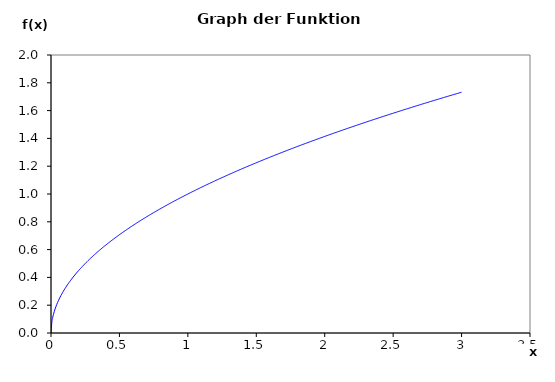
| Category | Series 0 |
|---|---|
| 0.0 | 0 |
| 0.006 | 0.077 |
| 0.012 | 0.11 |
| 0.018000000000000002 | 0.134 |
| 0.024 | 0.155 |
| 0.03 | 0.173 |
| 0.036 | 0.19 |
| 0.041999999999999996 | 0.205 |
| 0.047999999999999994 | 0.219 |
| 0.05399999999999999 | 0.232 |
| 0.05999999999999999 | 0.245 |
| 0.06599999999999999 | 0.257 |
| 0.072 | 0.268 |
| 0.078 | 0.279 |
| 0.084 | 0.29 |
| 0.09000000000000001 | 0.3 |
| 0.09600000000000002 | 0.31 |
| 0.10200000000000002 | 0.319 |
| 0.10800000000000003 | 0.329 |
| 0.11400000000000003 | 0.338 |
| 0.12000000000000004 | 0.346 |
| 0.12600000000000003 | 0.355 |
| 0.13200000000000003 | 0.363 |
| 0.13800000000000004 | 0.371 |
| 0.14400000000000004 | 0.379 |
| 0.15000000000000005 | 0.387 |
| 0.15600000000000006 | 0.395 |
| 0.16200000000000006 | 0.402 |
| 0.16800000000000007 | 0.41 |
| 0.17400000000000007 | 0.417 |
| 0.18000000000000008 | 0.424 |
| 0.18600000000000008 | 0.431 |
| 0.1920000000000001 | 0.438 |
| 0.1980000000000001 | 0.445 |
| 0.2040000000000001 | 0.452 |
| 0.2100000000000001 | 0.458 |
| 0.2160000000000001 | 0.465 |
| 0.22200000000000011 | 0.471 |
| 0.22800000000000012 | 0.477 |
| 0.23400000000000012 | 0.484 |
| 0.24000000000000013 | 0.49 |
| 0.24600000000000014 | 0.496 |
| 0.2520000000000001 | 0.502 |
| 0.2580000000000001 | 0.508 |
| 0.2640000000000001 | 0.514 |
| 0.27000000000000013 | 0.52 |
| 0.27600000000000013 | 0.525 |
| 0.28200000000000014 | 0.531 |
| 0.28800000000000014 | 0.537 |
| 0.29400000000000015 | 0.542 |
| 0.30000000000000016 | 0.548 |
| 0.30600000000000016 | 0.553 |
| 0.31200000000000017 | 0.559 |
| 0.31800000000000017 | 0.564 |
| 0.3240000000000002 | 0.569 |
| 0.3300000000000002 | 0.574 |
| 0.3360000000000002 | 0.58 |
| 0.3420000000000002 | 0.585 |
| 0.3480000000000002 | 0.59 |
| 0.3540000000000002 | 0.595 |
| 0.3600000000000002 | 0.6 |
| 0.3660000000000002 | 0.605 |
| 0.3720000000000002 | 0.61 |
| 0.3780000000000002 | 0.615 |
| 0.38400000000000023 | 0.62 |
| 0.39000000000000024 | 0.624 |
| 0.39600000000000024 | 0.629 |
| 0.40200000000000025 | 0.634 |
| 0.40800000000000025 | 0.639 |
| 0.41400000000000026 | 0.643 |
| 0.42000000000000026 | 0.648 |
| 0.42600000000000027 | 0.653 |
| 0.4320000000000003 | 0.657 |
| 0.4380000000000003 | 0.662 |
| 0.4440000000000003 | 0.666 |
| 0.4500000000000003 | 0.671 |
| 0.4560000000000003 | 0.675 |
| 0.4620000000000003 | 0.68 |
| 0.4680000000000003 | 0.684 |
| 0.4740000000000003 | 0.688 |
| 0.4800000000000003 | 0.693 |
| 0.4860000000000003 | 0.697 |
| 0.4920000000000003 | 0.701 |
| 0.49800000000000033 | 0.706 |
| 0.5040000000000003 | 0.71 |
| 0.5100000000000003 | 0.714 |
| 0.5160000000000003 | 0.718 |
| 0.5220000000000004 | 0.722 |
| 0.5280000000000004 | 0.727 |
| 0.5340000000000004 | 0.731 |
| 0.5400000000000004 | 0.735 |
| 0.5460000000000004 | 0.739 |
| 0.5520000000000004 | 0.743 |
| 0.5580000000000004 | 0.747 |
| 0.5640000000000004 | 0.751 |
| 0.5700000000000004 | 0.755 |
| 0.5760000000000004 | 0.759 |
| 0.5820000000000004 | 0.763 |
| 0.5880000000000004 | 0.767 |
| 0.5940000000000004 | 0.771 |
| 0.6000000000000004 | 0.775 |
| 0.6060000000000004 | 0.778 |
| 0.6120000000000004 | 0.782 |
| 0.6180000000000004 | 0.786 |
| 0.6240000000000004 | 0.79 |
| 0.6300000000000004 | 0.794 |
| 0.6360000000000005 | 0.797 |
| 0.6420000000000005 | 0.801 |
| 0.6480000000000005 | 0.805 |
| 0.6540000000000005 | 0.809 |
| 0.6600000000000005 | 0.812 |
| 0.6660000000000005 | 0.816 |
| 0.6720000000000005 | 0.82 |
| 0.6780000000000005 | 0.823 |
| 0.6840000000000005 | 0.827 |
| 0.6900000000000005 | 0.831 |
| 0.6960000000000005 | 0.834 |
| 0.7020000000000005 | 0.838 |
| 0.7080000000000005 | 0.841 |
| 0.7140000000000005 | 0.845 |
| 0.7200000000000005 | 0.849 |
| 0.7260000000000005 | 0.852 |
| 0.7320000000000005 | 0.856 |
| 0.7380000000000005 | 0.859 |
| 0.7440000000000005 | 0.863 |
| 0.7500000000000006 | 0.866 |
| 0.7560000000000006 | 0.869 |
| 0.7620000000000006 | 0.873 |
| 0.7680000000000006 | 0.876 |
| 0.7740000000000006 | 0.88 |
| 0.7800000000000006 | 0.883 |
| 0.7860000000000006 | 0.887 |
| 0.7920000000000006 | 0.89 |
| 0.7980000000000006 | 0.893 |
| 0.8040000000000006 | 0.897 |
| 0.8100000000000006 | 0.9 |
| 0.8160000000000006 | 0.903 |
| 0.8220000000000006 | 0.907 |
| 0.8280000000000006 | 0.91 |
| 0.8340000000000006 | 0.913 |
| 0.8400000000000006 | 0.917 |
| 0.8460000000000006 | 0.92 |
| 0.8520000000000006 | 0.923 |
| 0.8580000000000007 | 0.926 |
| 0.8640000000000007 | 0.93 |
| 0.8700000000000007 | 0.933 |
| 0.8760000000000007 | 0.936 |
| 0.8820000000000007 | 0.939 |
| 0.8880000000000007 | 0.942 |
| 0.8940000000000007 | 0.946 |
| 0.9000000000000007 | 0.949 |
| 0.9060000000000007 | 0.952 |
| 0.9120000000000007 | 0.955 |
| 0.9180000000000007 | 0.958 |
| 0.9240000000000007 | 0.961 |
| 0.9300000000000007 | 0.964 |
| 0.9360000000000007 | 0.967 |
| 0.9420000000000007 | 0.971 |
| 0.9480000000000007 | 0.974 |
| 0.9540000000000007 | 0.977 |
| 0.9600000000000007 | 0.98 |
| 0.9660000000000007 | 0.983 |
| 0.9720000000000008 | 0.986 |
| 0.9780000000000008 | 0.989 |
| 0.9840000000000008 | 0.992 |
| 0.9900000000000008 | 0.995 |
| 0.9960000000000008 | 0.998 |
| 1.0020000000000007 | 1.001 |
| 1.0080000000000007 | 1.004 |
| 1.0140000000000007 | 1.007 |
| 1.0200000000000007 | 1.01 |
| 1.0260000000000007 | 1.013 |
| 1.0320000000000007 | 1.016 |
| 1.0380000000000007 | 1.019 |
| 1.0440000000000007 | 1.022 |
| 1.0500000000000007 | 1.025 |
| 1.0560000000000007 | 1.028 |
| 1.0620000000000007 | 1.031 |
| 1.0680000000000007 | 1.033 |
| 1.0740000000000007 | 1.036 |
| 1.0800000000000007 | 1.039 |
| 1.0860000000000007 | 1.042 |
| 1.0920000000000007 | 1.045 |
| 1.0980000000000008 | 1.048 |
| 1.1040000000000008 | 1.051 |
| 1.1100000000000008 | 1.054 |
| 1.1160000000000008 | 1.056 |
| 1.1220000000000008 | 1.059 |
| 1.1280000000000008 | 1.062 |
| 1.1340000000000008 | 1.065 |
| 1.1400000000000008 | 1.068 |
| 1.1460000000000008 | 1.071 |
| 1.1520000000000008 | 1.073 |
| 1.1580000000000008 | 1.076 |
| 1.1640000000000008 | 1.079 |
| 1.1700000000000008 | 1.082 |
| 1.1760000000000008 | 1.084 |
| 1.1820000000000008 | 1.087 |
| 1.1880000000000008 | 1.09 |
| 1.1940000000000008 | 1.093 |
| 1.2000000000000008 | 1.095 |
| 1.2060000000000008 | 1.098 |
| 1.2120000000000009 | 1.101 |
| 1.2180000000000009 | 1.104 |
| 1.2240000000000009 | 1.106 |
| 1.2300000000000009 | 1.109 |
| 1.2360000000000009 | 1.112 |
| 1.2420000000000009 | 1.114 |
| 1.2480000000000009 | 1.117 |
| 1.254000000000001 | 1.12 |
| 1.260000000000001 | 1.122 |
| 1.266000000000001 | 1.125 |
| 1.272000000000001 | 1.128 |
| 1.278000000000001 | 1.13 |
| 1.284000000000001 | 1.133 |
| 1.290000000000001 | 1.136 |
| 1.296000000000001 | 1.138 |
| 1.302000000000001 | 1.141 |
| 1.308000000000001 | 1.144 |
| 1.314000000000001 | 1.146 |
| 1.320000000000001 | 1.149 |
| 1.326000000000001 | 1.152 |
| 1.332000000000001 | 1.154 |
| 1.338000000000001 | 1.157 |
| 1.344000000000001 | 1.159 |
| 1.350000000000001 | 1.162 |
| 1.356000000000001 | 1.164 |
| 1.362000000000001 | 1.167 |
| 1.368000000000001 | 1.17 |
| 1.374000000000001 | 1.172 |
| 1.380000000000001 | 1.175 |
| 1.386000000000001 | 1.177 |
| 1.392000000000001 | 1.18 |
| 1.398000000000001 | 1.182 |
| 1.404000000000001 | 1.185 |
| 1.410000000000001 | 1.187 |
| 1.416000000000001 | 1.19 |
| 1.422000000000001 | 1.192 |
| 1.428000000000001 | 1.195 |
| 1.434000000000001 | 1.197 |
| 1.440000000000001 | 1.2 |
| 1.446000000000001 | 1.202 |
| 1.452000000000001 | 1.205 |
| 1.458000000000001 | 1.207 |
| 1.464000000000001 | 1.21 |
| 1.470000000000001 | 1.212 |
| 1.476000000000001 | 1.215 |
| 1.482000000000001 | 1.217 |
| 1.488000000000001 | 1.22 |
| 1.494000000000001 | 1.222 |
| 1.500000000000001 | 1.225 |
| 1.5060000000000011 | 1.227 |
| 1.5120000000000011 | 1.23 |
| 1.5180000000000011 | 1.232 |
| 1.5240000000000011 | 1.235 |
| 1.5300000000000011 | 1.237 |
| 1.5360000000000011 | 1.239 |
| 1.5420000000000011 | 1.242 |
| 1.5480000000000012 | 1.244 |
| 1.5540000000000012 | 1.247 |
| 1.5600000000000012 | 1.249 |
| 1.5660000000000012 | 1.251 |
| 1.5720000000000012 | 1.254 |
| 1.5780000000000012 | 1.256 |
| 1.5840000000000012 | 1.259 |
| 1.5900000000000012 | 1.261 |
| 1.5960000000000012 | 1.263 |
| 1.6020000000000012 | 1.266 |
| 1.6080000000000012 | 1.268 |
| 1.6140000000000012 | 1.27 |
| 1.6200000000000012 | 1.273 |
| 1.6260000000000012 | 1.275 |
| 1.6320000000000012 | 1.277 |
| 1.6380000000000012 | 1.28 |
| 1.6440000000000012 | 1.282 |
| 1.6500000000000012 | 1.285 |
| 1.6560000000000012 | 1.287 |
| 1.6620000000000013 | 1.289 |
| 1.6680000000000013 | 1.292 |
| 1.6740000000000013 | 1.294 |
| 1.6800000000000013 | 1.296 |
| 1.6860000000000013 | 1.298 |
| 1.6920000000000013 | 1.301 |
| 1.6980000000000013 | 1.303 |
| 1.7040000000000013 | 1.305 |
| 1.7100000000000013 | 1.308 |
| 1.7160000000000013 | 1.31 |
| 1.7220000000000013 | 1.312 |
| 1.7280000000000013 | 1.315 |
| 1.7340000000000013 | 1.317 |
| 1.7400000000000013 | 1.319 |
| 1.7460000000000013 | 1.321 |
| 1.7520000000000013 | 1.324 |
| 1.7580000000000013 | 1.326 |
| 1.7640000000000013 | 1.328 |
| 1.7700000000000014 | 1.33 |
| 1.7760000000000014 | 1.333 |
| 1.7820000000000014 | 1.335 |
| 1.7880000000000014 | 1.337 |
| 1.7940000000000014 | 1.339 |
| 1.8000000000000014 | 1.342 |
| 1.8060000000000014 | 1.344 |
| 1.8120000000000014 | 1.346 |
| 1.8180000000000014 | 1.348 |
| 1.8240000000000014 | 1.351 |
| 1.8300000000000014 | 1.353 |
| 1.8360000000000014 | 1.355 |
| 1.8420000000000014 | 1.357 |
| 1.8480000000000014 | 1.359 |
| 1.8540000000000014 | 1.362 |
| 1.8600000000000014 | 1.364 |
| 1.8660000000000014 | 1.366 |
| 1.8720000000000014 | 1.368 |
| 1.8780000000000014 | 1.37 |
| 1.8840000000000015 | 1.373 |
| 1.8900000000000015 | 1.375 |
| 1.8960000000000015 | 1.377 |
| 1.9020000000000015 | 1.379 |
| 1.9080000000000015 | 1.381 |
| 1.9140000000000015 | 1.383 |
| 1.9200000000000015 | 1.386 |
| 1.9260000000000015 | 1.388 |
| 1.9320000000000015 | 1.39 |
| 1.9380000000000015 | 1.392 |
| 1.9440000000000015 | 1.394 |
| 1.9500000000000015 | 1.396 |
| 1.9560000000000015 | 1.399 |
| 1.9620000000000015 | 1.401 |
| 1.9680000000000015 | 1.403 |
| 1.9740000000000015 | 1.405 |
| 1.9800000000000015 | 1.407 |
| 1.9860000000000015 | 1.409 |
| 1.9920000000000015 | 1.411 |
| 1.9980000000000016 | 1.414 |
| 2.0040000000000013 | 1.416 |
| 2.010000000000001 | 1.418 |
| 2.016000000000001 | 1.42 |
| 2.0220000000000007 | 1.422 |
| 2.0280000000000005 | 1.424 |
| 2.0340000000000003 | 1.426 |
| 2.04 | 1.428 |
| 2.046 | 1.43 |
| 2.0519999999999996 | 1.432 |
| 2.0579999999999994 | 1.435 |
| 2.063999999999999 | 1.437 |
| 2.069999999999999 | 1.439 |
| 2.0759999999999987 | 1.441 |
| 2.0819999999999985 | 1.443 |
| 2.0879999999999983 | 1.445 |
| 2.093999999999998 | 1.447 |
| 2.099999999999998 | 1.449 |
| 2.1059999999999977 | 1.451 |
| 2.1119999999999974 | 1.453 |
| 2.117999999999997 | 1.455 |
| 2.123999999999997 | 1.457 |
| 2.129999999999997 | 1.459 |
| 2.1359999999999966 | 1.462 |
| 2.1419999999999964 | 1.464 |
| 2.147999999999996 | 1.466 |
| 2.153999999999996 | 1.468 |
| 2.1599999999999957 | 1.47 |
| 2.1659999999999955 | 1.472 |
| 2.1719999999999953 | 1.474 |
| 2.177999999999995 | 1.476 |
| 2.183999999999995 | 1.478 |
| 2.1899999999999946 | 1.48 |
| 2.1959999999999944 | 1.482 |
| 2.201999999999994 | 1.484 |
| 2.207999999999994 | 1.486 |
| 2.2139999999999938 | 1.488 |
| 2.2199999999999935 | 1.49 |
| 2.2259999999999933 | 1.492 |
| 2.231999999999993 | 1.494 |
| 2.237999999999993 | 1.496 |
| 2.2439999999999927 | 1.498 |
| 2.2499999999999925 | 1.5 |
| 2.2559999999999922 | 1.502 |
| 2.261999999999992 | 1.504 |
| 2.267999999999992 | 1.506 |
| 2.2739999999999916 | 1.508 |
| 2.2799999999999914 | 1.51 |
| 2.285999999999991 | 1.512 |
| 2.291999999999991 | 1.514 |
| 2.2979999999999907 | 1.516 |
| 2.3039999999999905 | 1.518 |
| 2.3099999999999903 | 1.52 |
| 2.31599999999999 | 1.522 |
| 2.32199999999999 | 1.524 |
| 2.3279999999999896 | 1.526 |
| 2.3339999999999894 | 1.528 |
| 2.339999999999989 | 1.53 |
| 2.345999999999989 | 1.532 |
| 2.3519999999999888 | 1.534 |
| 2.3579999999999885 | 1.536 |
| 2.3639999999999883 | 1.538 |
| 2.369999999999988 | 1.539 |
| 2.375999999999988 | 1.541 |
| 2.3819999999999877 | 1.543 |
| 2.3879999999999875 | 1.545 |
| 2.3939999999999872 | 1.547 |
| 2.399999999999987 | 1.549 |
| 2.405999999999987 | 1.551 |
| 2.4119999999999866 | 1.553 |
| 2.4179999999999864 | 1.555 |
| 2.423999999999986 | 1.557 |
| 2.429999999999986 | 1.559 |
| 2.4359999999999857 | 1.561 |
| 2.4419999999999855 | 1.563 |
| 2.4479999999999853 | 1.565 |
| 2.453999999999985 | 1.567 |
| 2.459999999999985 | 1.568 |
| 2.4659999999999846 | 1.57 |
| 2.4719999999999844 | 1.572 |
| 2.477999999999984 | 1.574 |
| 2.483999999999984 | 1.576 |
| 2.489999999999984 | 1.578 |
| 2.4959999999999836 | 1.58 |
| 2.5019999999999833 | 1.582 |
| 2.507999999999983 | 1.584 |
| 2.513999999999983 | 1.586 |
| 2.5199999999999827 | 1.587 |
| 2.5259999999999825 | 1.589 |
| 2.5319999999999823 | 1.591 |
| 2.537999999999982 | 1.593 |
| 2.543999999999982 | 1.595 |
| 2.5499999999999816 | 1.597 |
| 2.5559999999999814 | 1.599 |
| 2.561999999999981 | 1.601 |
| 2.567999999999981 | 1.602 |
| 2.5739999999999807 | 1.604 |
| 2.5799999999999805 | 1.606 |
| 2.5859999999999803 | 1.608 |
| 2.59199999999998 | 1.61 |
| 2.59799999999998 | 1.612 |
| 2.6039999999999797 | 1.614 |
| 2.6099999999999794 | 1.616 |
| 2.6159999999999792 | 1.617 |
| 2.621999999999979 | 1.619 |
| 2.627999999999979 | 1.621 |
| 2.6339999999999786 | 1.623 |
| 2.6399999999999784 | 1.625 |
| 2.645999999999978 | 1.627 |
| 2.651999999999978 | 1.628 |
| 2.6579999999999777 | 1.63 |
| 2.6639999999999775 | 1.632 |
| 2.6699999999999773 | 1.634 |
| 2.675999999999977 | 1.636 |
| 2.681999999999977 | 1.638 |
| 2.6879999999999766 | 1.64 |
| 2.6939999999999764 | 1.641 |
| 2.699999999999976 | 1.643 |
| 2.705999999999976 | 1.645 |
| 2.7119999999999758 | 1.647 |
| 2.7179999999999755 | 1.649 |
| 2.7239999999999753 | 1.65 |
| 2.729999999999975 | 1.652 |
| 2.735999999999975 | 1.654 |
| 2.7419999999999747 | 1.656 |
| 2.7479999999999745 | 1.658 |
| 2.7539999999999742 | 1.66 |
| 2.759999999999974 | 1.661 |
| 2.765999999999974 | 1.663 |
| 2.7719999999999736 | 1.665 |
| 2.7779999999999734 | 1.667 |
| 2.783999999999973 | 1.669 |
| 2.789999999999973 | 1.67 |
| 2.7959999999999727 | 1.672 |
| 2.8019999999999725 | 1.674 |
| 2.8079999999999723 | 1.676 |
| 2.813999999999972 | 1.677 |
| 2.819999999999972 | 1.679 |
| 2.8259999999999716 | 1.681 |
| 2.8319999999999714 | 1.683 |
| 2.837999999999971 | 1.685 |
| 2.843999999999971 | 1.686 |
| 2.849999999999971 | 1.688 |
| 2.8559999999999706 | 1.69 |
| 2.8619999999999703 | 1.692 |
| 2.86799999999997 | 1.694 |
| 2.87399999999997 | 1.695 |
| 2.8799999999999697 | 1.697 |
| 2.8859999999999695 | 1.699 |
| 2.8919999999999693 | 1.701 |
| 2.897999999999969 | 1.702 |
| 2.903999999999969 | 1.704 |
| 2.9099999999999686 | 1.706 |
| 2.9159999999999684 | 1.708 |
| 2.921999999999968 | 1.709 |
| 2.927999999999968 | 1.711 |
| 2.9339999999999677 | 1.713 |
| 2.9399999999999675 | 1.715 |
| 2.9459999999999673 | 1.716 |
| 2.951999999999967 | 1.718 |
| 2.957999999999967 | 1.72 |
| 2.9639999999999667 | 1.722 |
| 2.9699999999999664 | 1.723 |
| 2.9759999999999662 | 1.725 |
| 2.981999999999966 | 1.727 |
| 2.987999999999966 | 1.729 |
| 2.9939999999999656 | 1.73 |
| 2.9999999999999654 | 1.732 |